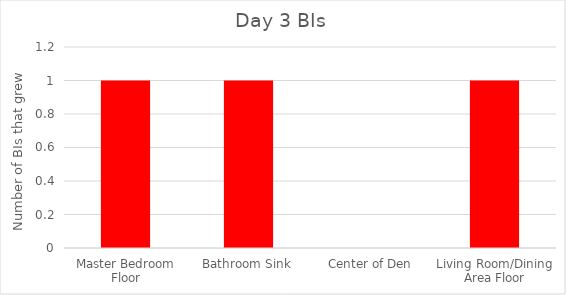
| Category | Series 0 |
|---|---|
| Master Bedroom Floor | 1 |
| Bathroom Sink | 1 |
| Center of Den | 0 |
| Living Room/Dining Area Floor | 1 |